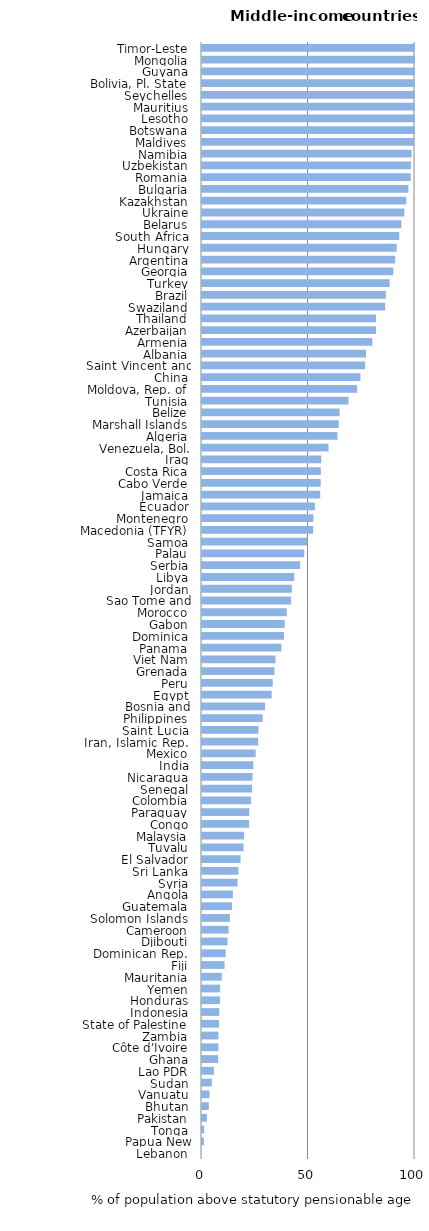
| Category | Series 0 |
|---|---|
| Lebanon | 0 |
| Papua New Guinea | 0.9 |
| Tonga | 1 |
| Pakistan | 2.3 |
| Bhutan | 3.2 |
| Vanuatu | 3.5 |
| Sudan | 4.6 |
| Lao PDR | 5.6 |
| Ghana | 7.6 |
| Côte d'Ivoire | 7.7 |
| Zambia | 7.7 |
| State of Palestine | 8 |
| Indonesia | 8.1 |
| Honduras | 8.4 |
| Yemen | 8.5 |
| Mauritania | 9.3 |
| Fiji | 10.6 |
| Dominican Rep. | 11.1 |
| Djibouti | 12 |
| Cameroon | 12.5 |
| Solomon Islands | 13.1 |
| Guatemala | 14.1 |
| Angola | 14.5 |
| Syria | 16.7 |
| Sri Lanka | 17.1 |
| El Salvador | 18.1 |
| Tuvalu | 19.5 |
| Malaysia | 19.8 |
| Congo | 22.1 |
| Paraguay | 22.2 |
| Colombia | 23 |
| Senegal | 23.5 |
| Nicaragua | 23.7 |
| India | 24.1 |
| Mexico | 25.2 |
| Iran, Islamic Rep. | 26.4 |
| Saint Lucia | 26.5 |
| Philippines | 28.5 |
| Bosnia and Herzegovina | 29.6 |
| Egypt | 32.7 |
| Peru | 33.2 |
| Grenada | 34 |
| Viet Nam | 34.5 |
| Panama | 37.3 |
| Dominica | 38.5 |
| Gabon | 38.8 |
| Morocco | 39.8 |
| Sao Tome and Principe | 41.8 |
| Jordan | 42.2 |
| Libya | 43.3 |
| Serbia | 46.1 |
| Palau | 48 |
| Samoa | 49.5 |
| Macedonia (TFYR) | 52.2 |
| Montenegro | 52.3 |
| Ecuador | 53 |
| Jamaica | 55.5 |
| Cabo Verde | 55.7 |
| Costa Rica | 55.8 |
| Iraq | 56 |
| Venezuela, Bol. Rep. | 59.4 |
| Algeria | 63.6 |
| Marshall Islands | 64.2 |
| Belize | 64.6 |
| Tunisia | 68.8 |
| Moldova, Rep. of | 72.8 |
| China | 74.4 |
| Saint Vincent and the Grenadines | 76.6 |
| Albania | 77 |
| Armenia | 80 |
| Azerbaijan | 81.7 |
| Thailand | 81.7 |
| Swaziland | 86 |
| Brazil | 86.3 |
| Turkey | 88.1 |
| Georgia | 89.8 |
| Argentina | 90.7 |
| Hungary | 91.4 |
| South Africa | 92.6 |
| Belarus | 93.6 |
| Ukraine | 95 |
| Kazakhstan | 95.9 |
| Bulgaria | 96.9 |
| Romania | 98 |
| Uzbekistan | 98.1 |
| Namibia | 98.4 |
| Maldives | 99.7 |
| Botswana | 100 |
| Lesotho | 100 |
| Mauritius | 100 |
| Seychelles | 100 |
| Bolivia, Pl. State | 100 |
| Guyana | 100 |
| Mongolia | 100 |
| Timor-Leste | 100 |